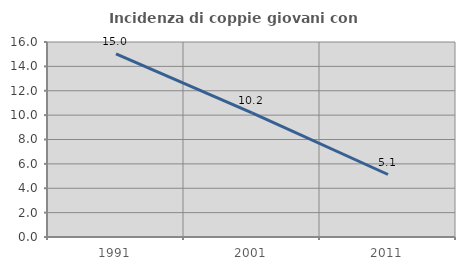
| Category | Incidenza di coppie giovani con figli |
|---|---|
| 1991.0 | 15.021 |
| 2001.0 | 10.189 |
| 2011.0 | 5.128 |